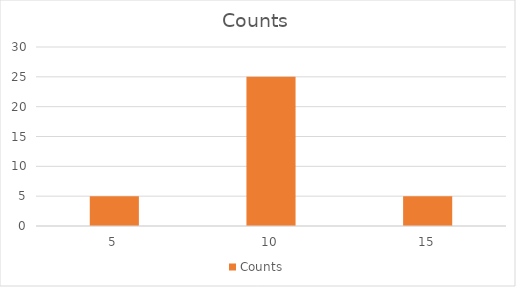
| Category | Counts |
|---|---|
| 5.0 | 5 |
| 10.0 | 25 |
| 15.0 | 5 |